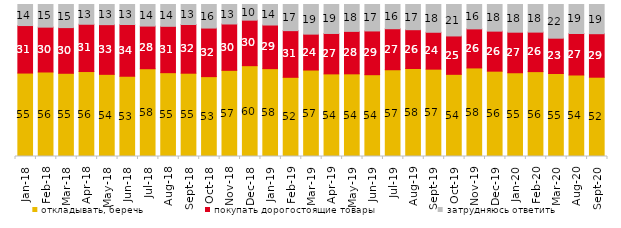
| Category | откладывать, беречь | покупать дорогостоящие товары | затрудняюсь ответить |
|---|---|---|---|
| 2018-01-01 | 54.9 | 31.25 | 13.85 |
| 2018-02-01 | 55.6 | 29.5 | 14.9 |
| 2018-03-01 | 54.75 | 30.05 | 15.2 |
| 2018-04-01 | 55.9 | 31.1 | 13 |
| 2018-05-01 | 54.05 | 32.7 | 13.25 |
| 2018-06-01 | 52.85 | 34 | 13.15 |
| 2018-07-01 | 57.75 | 28.05 | 14.2 |
| 2018-08-01 | 55.15 | 30.5 | 14.35 |
| 2018-09-01 | 54.8 | 32.05 | 13.15 |
| 2018-10-01 | 52.55 | 31.95 | 15.5 |
| 2018-11-01 | 56.687 | 30.489 | 12.824 |
| 2018-12-01 | 59.75 | 29.95 | 10.3 |
| 2019-01-01 | 57.8 | 28.7 | 13.5 |
| 2019-02-01 | 52.1 | 30.7 | 17.2 |
| 2019-03-01 | 56.887 | 23.62 | 19.493 |
| 2019-04-01 | 54.356 | 26.584 | 19.059 |
| 2019-05-01 | 54.383 | 27.935 | 17.682 |
| 2019-06-01 | 53.815 | 28.778 | 17.406 |
| 2019-07-01 | 57.079 | 26.98 | 15.941 |
| 2019-08-01 | 57.892 | 25.524 | 16.583 |
| 2019-09-01 | 57.475 | 24.257 | 18.267 |
| 2019-10-01 | 54.059 | 25.248 | 20.693 |
| 2019-11-01 | 58.267 | 25.693 | 16.04 |
| 2019-12-01 | 56.139 | 26.337 | 17.525 |
| 2020-01-01 | 55.099 | 26.683 | 18.218 |
| 2020-02-01 | 55.842 | 25.99 | 18.168 |
| 2020-03-01 | 54.586 | 23.252 | 22.162 |
| 2020-08-01 | 53.625 | 27.309 | 19.067 |
| 2020-09-01 | 52.165 | 28.621 | 19.214 |